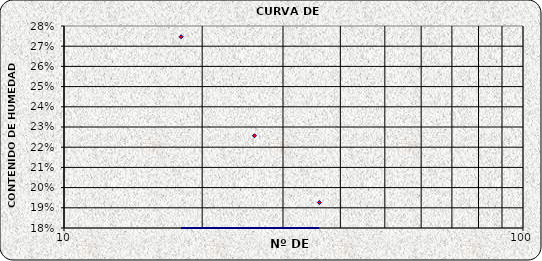
| Category | Series 0 |
|---|---|
| 36.0 | 0.193 |
| 26.0 | 0.226 |
| 18.0 | 0.275 |